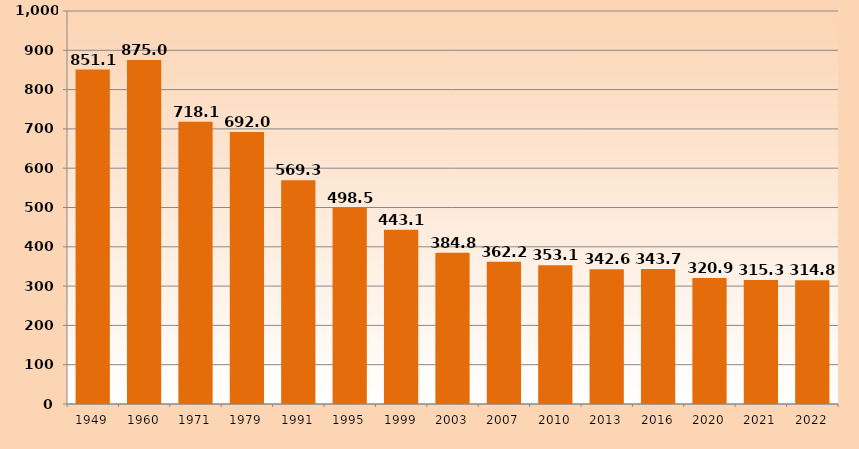
| Category | Series 1 |
|---|---|
| 1949.0 | 851.108 |
| 1960.0 | 875.024 |
| 1971.0 | 718.123 |
| 1979.0 | 691.992 |
| 1991.0 | 569.31 |
| 1995.0 | 498.5 |
| 1999.0 | 443.141 |
| 2003.0 | 384.8 |
| 2007.0 | 362.212 |
| 2010.0 | 353.099 |
| 2013.0 | 342.635 |
| 2016.0 | 343.72 |
| 2020.0 | 320.852 |
| 2021.0 | 315.337 |
| 2022.0 | 314.796 |